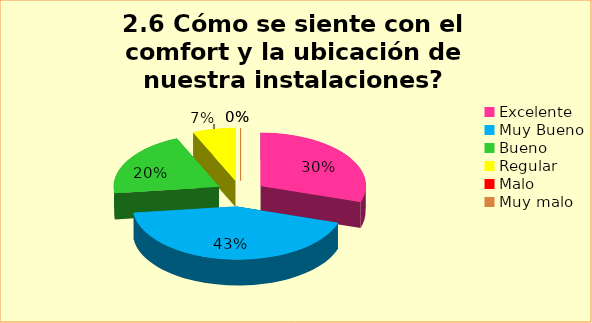
| Category | Series 0 |
|---|---|
| Excelente | 0.299 |
| Muy Bueno | 0.431 |
| Bueno  | 0.204 |
| Regular  | 0.066 |
| Malo  | 0 |
| Muy malo  | 0 |